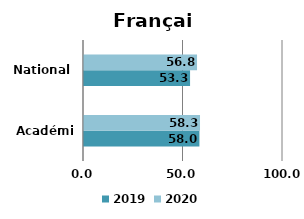
| Category | 2019 | 2020 |
|---|---|---|
| Académie | 58 | 58.3 |
| National | 53.3 | 56.8 |